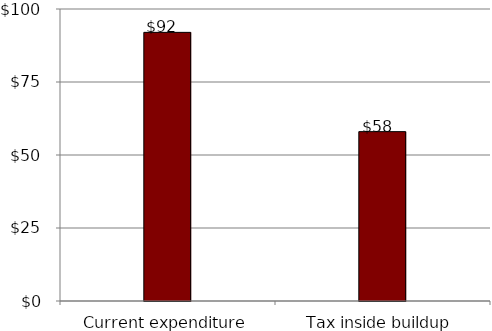
| Category | Series 0 |
|---|---|
| Current expenditure | 92 |
| Tax inside buildup | 58 |